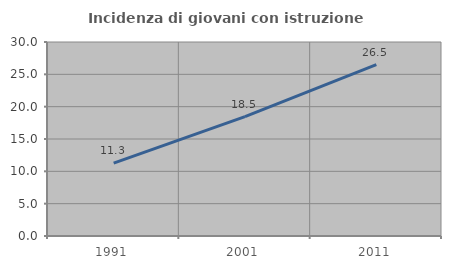
| Category | Incidenza di giovani con istruzione universitaria |
|---|---|
| 1991.0 | 11.279 |
| 2001.0 | 18.472 |
| 2011.0 | 26.508 |